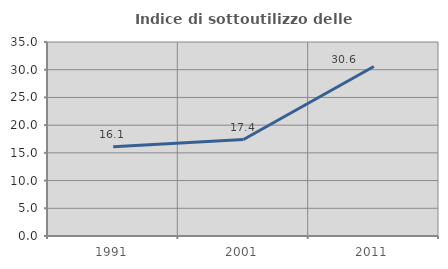
| Category | Indice di sottoutilizzo delle abitazioni  |
|---|---|
| 1991.0 | 16.103 |
| 2001.0 | 17.4 |
| 2011.0 | 30.575 |